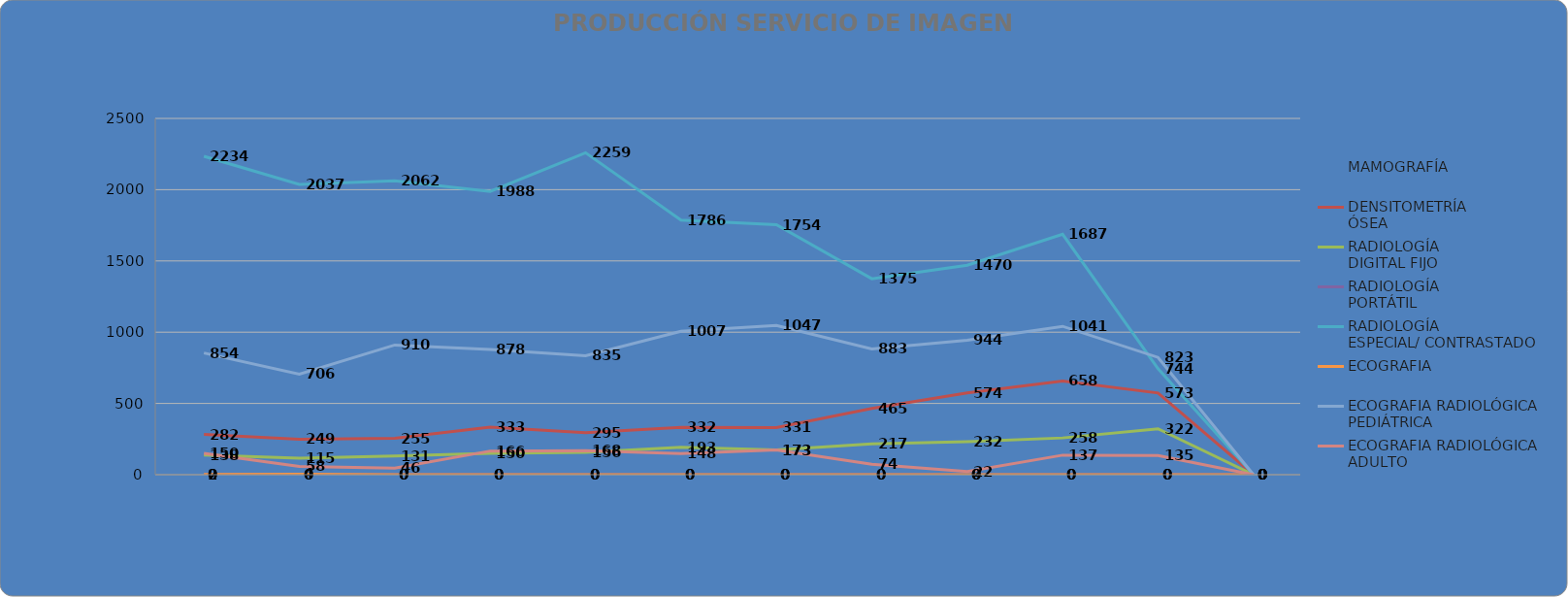
| Category | MAMOGRAFÍA | DENSITOMETRÍA
ÓSEA  | RADIOLOGÍA 
DIGITAL FIJO | RADIOLOGÍA 
PORTÁTIL | RADIOLOGÍA 
ESPECIAL/ CONTRASTADO | ECOGRAFIA  | ECOGRAFIA RADIOLÓGICA 
PEDIÁTRICA  | ECOGRAFIA RADIOLÓGICA 
ADULTO  |
|---|---|---|---|---|---|---|---|---|
|  | 0 | 282 | 138 | 0 | 2234 | 2 | 854 | 150 |
|  | 0 | 249 | 115 | 0 | 2037 | 4 | 706 | 58 |
|  | 0 | 255 | 131 | 0 | 2062 | 0 | 910 | 46 |
|  | 0 | 333 | 150 | 0 | 1988 | 0 | 878 | 166 |
|  | 0 | 295 | 156 | 0 | 2259 | 0 | 835 | 168 |
|  | 0 | 332 | 193 | 0 | 1786 | 0 | 1007 | 148 |
|  | 0 | 331 | 173 | 0 | 1754 | 0 | 1047 | 173 |
|  | 0 | 465 | 217 | 0 | 1375 | 0 | 883 | 74 |
|  | 0 | 574 | 232 | 0 | 1470 | 0 | 944 | 22 |
|  | 0 | 658 | 258 | 0 | 1687 | 0 | 1041 | 137 |
|  | 0 | 573 | 322 | 0 | 744 | 0 | 823 | 135 |
|  | 0 | 0 | 0 | 0 | 0 | 0 | 0 | 0 |